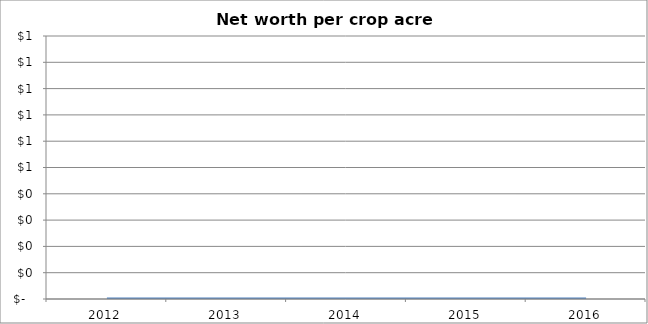
| Category | Net worth per crop acre [5/P] |
|---|---|
| 2012.0 | 0 |
| 2013.0 | 0 |
| 2014.0 | 0 |
| 2015.0 | 0 |
| 2016.0 | 0 |